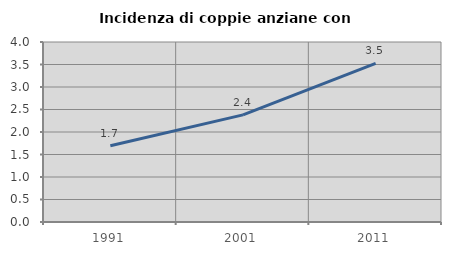
| Category | Incidenza di coppie anziane con figli |
|---|---|
| 1991.0 | 1.696 |
| 2001.0 | 2.381 |
| 2011.0 | 3.526 |